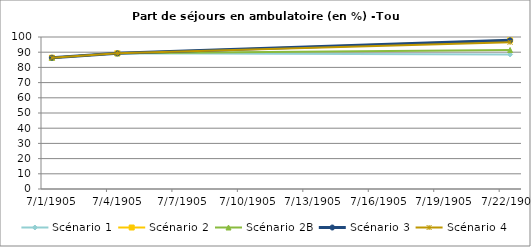
| Category | Scénario 1 | Scénario 2 | Scénario 2B | Scénario 3 | Scénario 4 |
|---|---|---|---|---|---|
| 2009.0 | 86.367 | 86.367 | 86.367 | 86.367 | 86.367 |
| 2012.0 | 89.243 | 89.243 | 89.243 | 89.243 | 89.243 |
| 2030.0 | 88.498 | 97.812 | 91.451 | 97.812 | 96.501 |